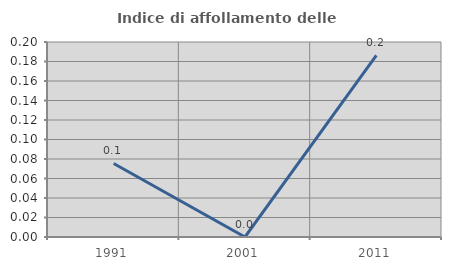
| Category | Indice di affollamento delle abitazioni  |
|---|---|
| 1991.0 | 0.075 |
| 2001.0 | 0 |
| 2011.0 | 0.186 |